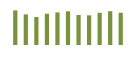
| Category | Saldo [ (1)-(2) ] |
|---|---|
| 0 | 329612.931 |
| 1 | 291358.085 |
| 2 | 266512.131 |
| 3 | 297562.723 |
| 4 | 310243.352 |
| 5 | 320678.349 |
| 6 | 286223.006 |
| 7 | 282809.198 |
| 8 | 306315.684 |
| 9 | 322094.884 |
| 10 | 306879.868 |